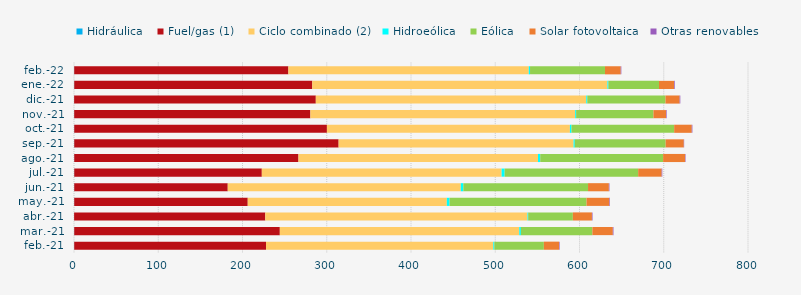
| Category | Hidráulica | Fuel/gas (1) | Ciclo combinado (2) | Hidroeólica | Eólica | Solar fotovoltaica | Otras renovables |
|---|---|---|---|---|---|---|---|
| feb.-21 | 0.259 | 227.675 | 269.761 | 1.226 | 58.778 | 18.033 | 0.7 |
| mar.-21 | 0.282 | 244.022 | 284.196 | 1.921 | 84.842 | 24.291 | 0.792 |
| abr.-21 | 0.138 | 226.895 | 311.21 | 0.836 | 53.036 | 22.65 | 0.722 |
| may.-21 | 0.268 | 205.958 | 236.283 | 3.227 | 162.608 | 27.065 | 0.723 |
| jun.-21 | 0.282 | 182.213 | 276.616 | 3.002 | 148.018 | 24.711 | 0.724 |
| jul.-21 | 0.29 | 222.639 | 284.61 | 3.578 | 158.515 | 27.905 | 0.734 |
| ago.-21 | 0.281 | 266.149 | 284.301 | 2.663 | 145.857 | 26.076 | 0.57 |
| sep.-21 | 0.278 | 313.815 | 278.888 | 1.42 | 107.853 | 21.557 | 0.4 |
| oct.-21 | 0.282 | 299.917 | 288.429 | 1.853 | 121.873 | 20.903 | 0.756 |
| nov.-21 | 0.231 | 280.341 | 314.273 | 1.14 | 91.77 | 14.926 | 0.753 |
| dic.-21 | 0.155 | 286.856 | 321.013 | 1.228 | 92.799 | 16.797 | 0.822 |
| ene.-22 | 0.294 | 282.523 | 350.314 | 1.111 | 60.108 | 17.847 | 0.861 |
| feb.-22 | 0.251 | 254.215 | 285.333 | 1.482 | 88.97 | 18.69 | 0.721 |